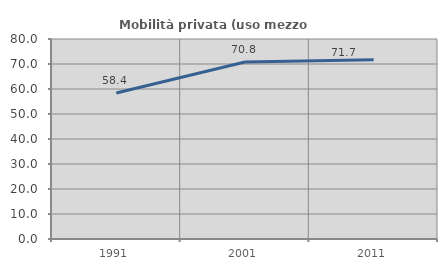
| Category | Mobilità privata (uso mezzo privato) |
|---|---|
| 1991.0 | 58.377 |
| 2001.0 | 70.818 |
| 2011.0 | 71.68 |